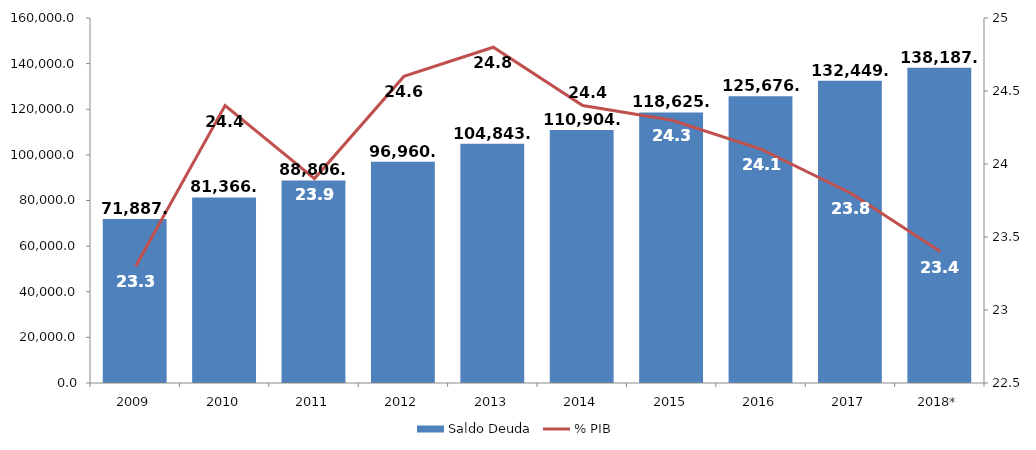
| Category | Saldo Deuda |
|---|---|
| 2009 | 71887.68 |
| 2010 | 81366.89 |
| 2011 | 88806.8 |
| 2012 | 96960.33 |
| 2013 | 104843.92 |
| 2014 | 110904.06 |
| 2015 | 118625.74 |
| 2016 | 125676.09 |
| 2017 | 132449.59 |
| 2018* | 138187.62 |